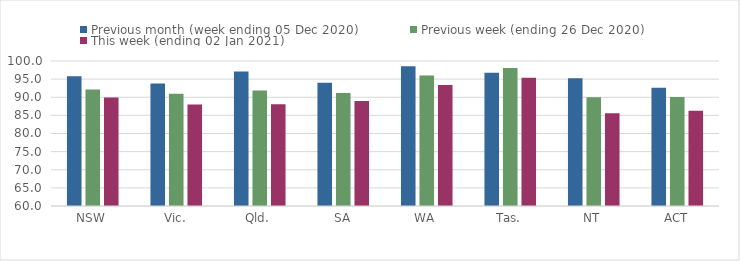
| Category | Previous month (week ending 05 Dec 2020) | Previous week (ending 26 Dec 2020) | This week (ending 02 Jan 2021) |
|---|---|---|---|
| NSW | 95.78 | 92.11 | 89.92 |
| Vic. | 93.78 | 90.97 | 87.98 |
| Qld. | 97.11 | 91.88 | 88.1 |
| SA | 93.99 | 91.17 | 88.94 |
| WA | 98.57 | 96.02 | 93.4 |
| Tas. | 96.77 | 98.08 | 95.35 |
| NT | 95.23 | 90.01 | 85.58 |
| ACT | 92.6 | 90.07 | 86.27 |